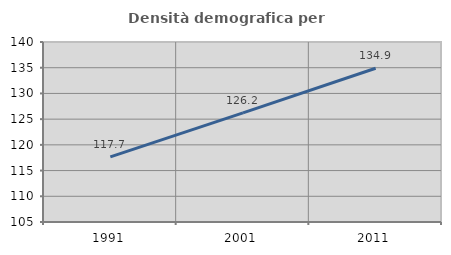
| Category | Densità demografica |
|---|---|
| 1991.0 | 117.672 |
| 2001.0 | 126.227 |
| 2011.0 | 134.897 |